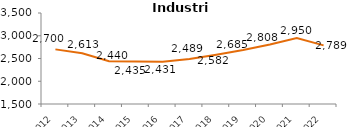
| Category | Industria |
|---|---|
| 2012.0 | 2700.4 |
| 2013.0 | 2613.4 |
| 2014.0 | 2439.8 |
| 2015.0 | 2435 |
| 2016.0 | 2431.3 |
| 2017.0 | 2489.4 |
| 2018.0 | 2582.4 |
| 2019.0 | 2685.4 |
| 2020.0 | 2808.2 |
| 2021.0 | 2950.3 |
| 2022.0 | 2788.7 |